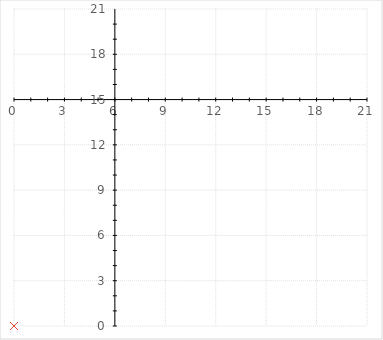
| Category | At-Risk |
|---|---|
| 0.0 | 0 |